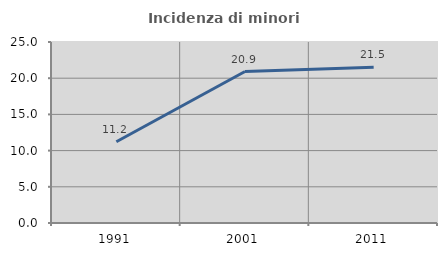
| Category | Incidenza di minori stranieri |
|---|---|
| 1991.0 | 11.221 |
| 2001.0 | 20.918 |
| 2011.0 | 21.517 |